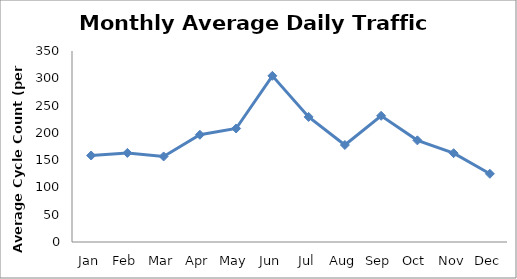
| Category | Series 0 |
|---|---|
| Jan | 158.5 |
| Feb | 163.25 |
| Mar | 156.75 |
| Apr | 196.5 |
| May | 208 |
| Jun | 304.5 |
| Jul | 229.25 |
| Aug | 177.75 |
| Sep | 231.25 |
| Oct | 186.25 |
| Nov | 162.75 |
| Dec | 125 |